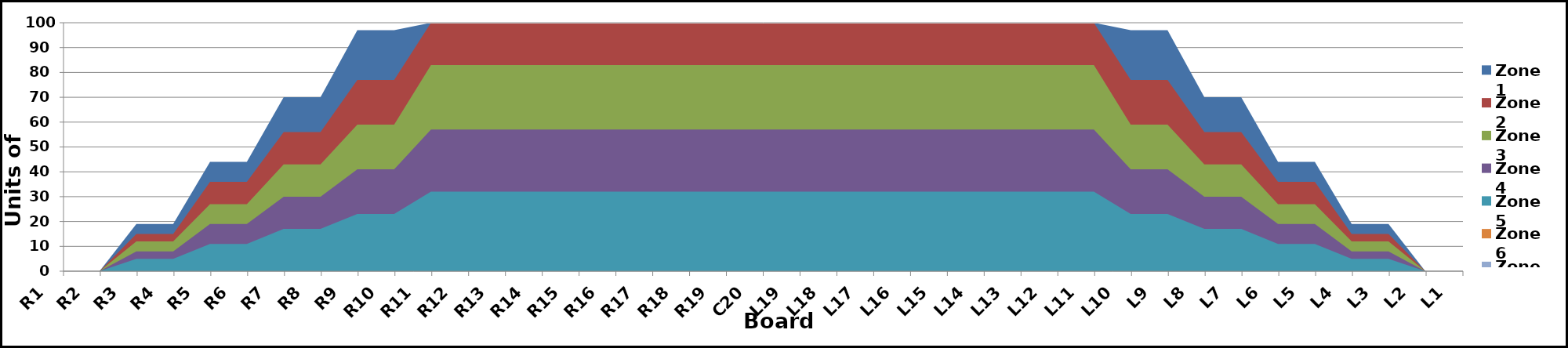
| Category | Zone 1 | Zone 2 | Zone 3 | Zone 4 | Zone 5 | Zone 6 | Zone 7 | Zone 8 |
|---|---|---|---|---|---|---|---|---|
| L1 | 0 | 0 | 0 | 0 | 0 | 0 | 0 | 0 |
| L2 | 0 | 0 | 0 | 0 | 0 | 0 | 0 | 0 |
| L3 | 19 | 15 | 12 | 8 | 5 | 0 | 0 | 0 |
| L4 | 19 | 15 | 12 | 8 | 5 | 0 | 0 | 0 |
| L5 | 44 | 36 | 27 | 19 | 11 | 0 | 0 | 0 |
| L6 | 44 | 36 | 27 | 19 | 11 | 0 | 0 | 0 |
| L7 | 70 | 56 | 43 | 30 | 17 | 0 | 0 | 0 |
| L8 | 70 | 56 | 43 | 30 | 17 | 0 | 0 | 0 |
| L9 | 97 | 77 | 59 | 41 | 23 | 0 | 0 | 0 |
| L10 | 97 | 77 | 59 | 41 | 23 | 0 | 0 | 0 |
| L11 | 100 | 100 | 83 | 57 | 32 | 0 | 0 | 0 |
| L12 | 100 | 100 | 83 | 57 | 32 | 0 | 0 | 0 |
| L13 | 100 | 100 | 83 | 57 | 32 | 0 | 0 | 0 |
| L14 | 100 | 100 | 83 | 57 | 32 | 0 | 0 | 0 |
| L15 | 100 | 100 | 83 | 57 | 32 | 0 | 0 | 0 |
| L16 | 100 | 100 | 83 | 57 | 32 | 0 | 0 | 0 |
| L17 | 100 | 100 | 83 | 57 | 32 | 0 | 0 | 0 |
| L18 | 100 | 100 | 83 | 57 | 32 | 0 | 0 | 0 |
| L19 | 100 | 100 | 83 | 57 | 32 | 0 | 0 | 0 |
| C20 | 100 | 100 | 83 | 57 | 32 | 0 | 0 | 0 |
| R19 | 100 | 100 | 83 | 57 | 32 | 0 | 0 | 0 |
| R18 | 100 | 100 | 83 | 57 | 32 | 0 | 0 | 0 |
| R17 | 100 | 100 | 83 | 57 | 32 | 0 | 0 | 0 |
| R16 | 100 | 100 | 83 | 57 | 32 | 0 | 0 | 0 |
| R15 | 100 | 100 | 83 | 57 | 32 | 0 | 0 | 0 |
| R14 | 100 | 100 | 83 | 57 | 32 | 0 | 0 | 0 |
| R13 | 100 | 100 | 83 | 57 | 32 | 0 | 0 | 0 |
| R12 | 100 | 100 | 83 | 57 | 32 | 0 | 0 | 0 |
| R11 | 100 | 100 | 83 | 57 | 32 | 0 | 0 | 0 |
| R10 | 97 | 77 | 59 | 41 | 23 | 0 | 0 | 0 |
| R9 | 97 | 77 | 59 | 41 | 23 | 0 | 0 | 0 |
| R8 | 70 | 56 | 43 | 30 | 17 | 0 | 0 | 0 |
| R7 | 70 | 56 | 43 | 30 | 17 | 0 | 0 | 0 |
| R6 | 44 | 36 | 27 | 19 | 11 | 0 | 0 | 0 |
| R5 | 44 | 36 | 27 | 19 | 11 | 0 | 0 | 0 |
| R4 | 19 | 15 | 12 | 8 | 5 | 0 | 0 | 0 |
| R3 | 19 | 15 | 12 | 8 | 5 | 0 | 0 | 0 |
| R2 | 0 | 0 | 0 | 0 | 0 | 0 | 0 | 0 |
| R1 | 0 | 0 | 0 | 0 | 0 | 0 | 0 | 0 |